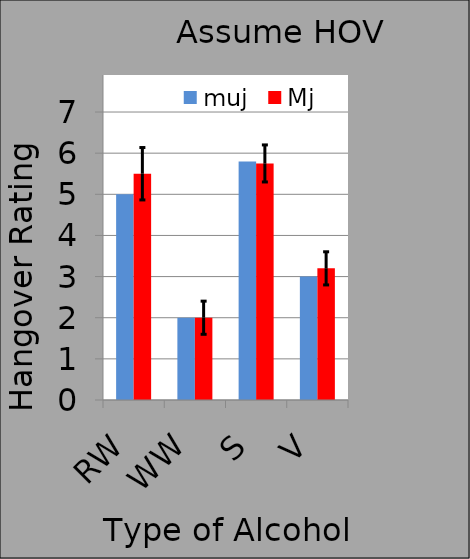
| Category | muj | Mj |
|---|---|---|
| RW | 5 | 5.5 |
| WW | 2 | 2 |
| S | 5.8 | 5.75 |
| V | 3 | 3.2 |